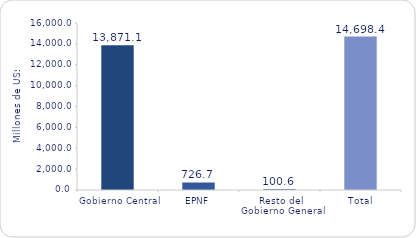
| Category | Series 1 |
|---|---|
| Gobierno Central | 13871.1 |
| EPNF | 726.7 |
| Resto del Gobierno General | 100.6 |
| Total | 14698.4 |